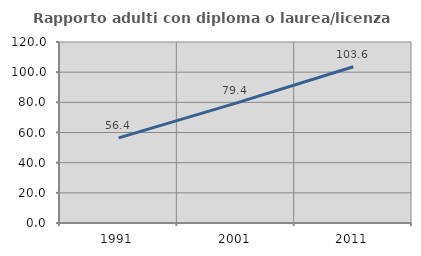
| Category | Rapporto adulti con diploma o laurea/licenza media  |
|---|---|
| 1991.0 | 56.41 |
| 2001.0 | 79.442 |
| 2011.0 | 103.604 |